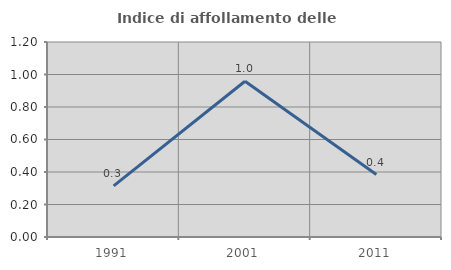
| Category | Indice di affollamento delle abitazioni  |
|---|---|
| 1991.0 | 0.314 |
| 2001.0 | 0.958 |
| 2011.0 | 0.385 |